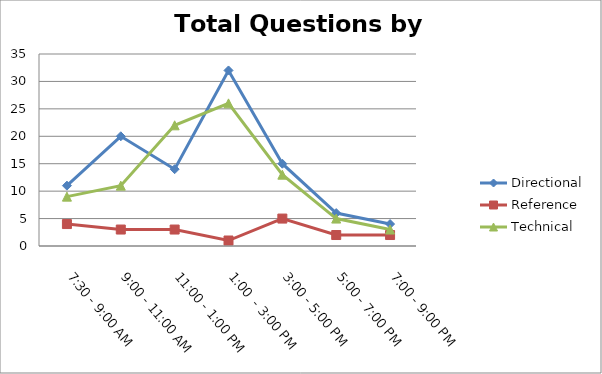
| Category | Directional | Reference | Technical |
|---|---|---|---|
| 7:30 - 9:00 AM | 11 | 4 | 9 |
| 9:00 - 11:00 AM | 20 | 3 | 11 |
| 11:00 - 1:00 PM | 14 | 3 | 22 |
| 1:00  - 3:00 PM | 32 | 1 | 26 |
| 3:00 - 5:00 PM | 15 | 5 | 13 |
| 5:00 - 7:00 PM | 6 | 2 | 5 |
| 7:00 - 9:00 PM | 4 | 2 | 3 |